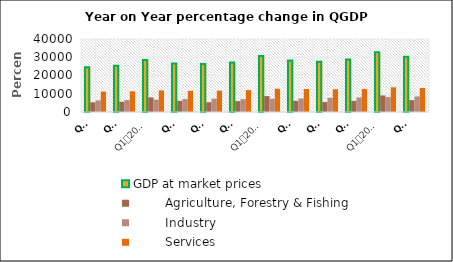
| Category | GDP at market prices |         Agriculture, Forestry & Fishing |         Industry |         Services |
|---|---|---|---|---|
| 0 | 24503.419 | 5306.676 | 6342.987 | 11186.957 |
| 1 | 25303.519 | 5631.009 | 6523.848 | 11366.045 |
| 2 | 28485.585 | 8026.013 | 6754.597 | 11873.876 |
| 3 | 26556.754 | 6117.327 | 7105.958 | 11586.159 |
| 4 | 26359.326 | 5355.591 | 7322.414 | 11698.708 |
| 5 | 27116.376 | 5958.138 | 7065.357 | 12023.272 |
| 6 | 30721.31 | 8717.295 | 7287.572 | 12747.341 |
| 7 | 28185.425 | 6155.818 | 7434.439 | 12604.939 |
| 8 | 27567.514 | 5454.414 | 7795.884 | 12466.952 |
| 9 | 28723.159 | 6096.249 | 7988.296 | 12656.924 |
| 10 | 32675.491 | 9065.5 | 8197.045 | 13531.097 |
| 11 | 30235.225 | 6490.861 | 8524.86 | 13183.526 |